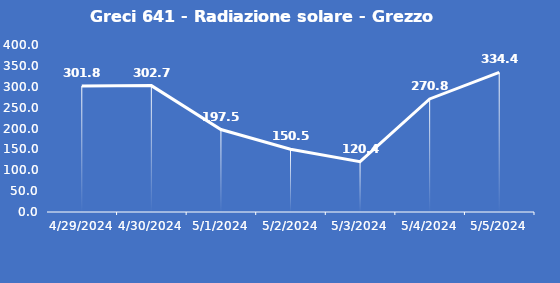
| Category | Greci 641 - Radiazione solare - Grezzo (W/m2) |
|---|---|
| 4/29/24 | 301.8 |
| 4/30/24 | 302.7 |
| 5/1/24 | 197.5 |
| 5/2/24 | 150.5 |
| 5/3/24 | 120.4 |
| 5/4/24 | 270.8 |
| 5/5/24 | 334.4 |